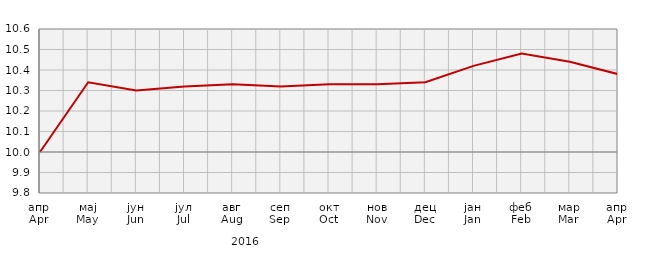
| Category | Series 0 |
|---|---|
| апр
Apr | 100 |
| мај
May | 103.4 |
| јун
Jun | 103 |
| јул
Jul | 103.2 |
| авг
Aug | 103.3 |
| сеп
Sep | 103.2 |
| окт
Oct | 103.3 |
| нов
Nov | 103.3 |
| дец
Dec | 103.4 |
| јан
Jan | 104.2 |
| феб
Feb | 104.8 |
| мар
Mar | 104.4 |
| апр
Apr | 103.8 |